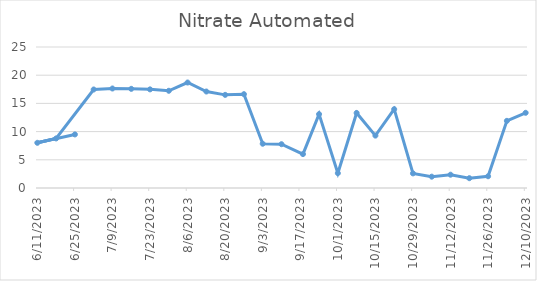
| Category | Series 0 |
|---|---|
| 6/25/23 | 9.499 |
| 6/11/23 | 8.014 |
| 6/18/23 | 8.787 |
| 7/2/23 | 17.468 |
| 7/9/23 | 17.642 |
| 7/16/23 | 17.58 |
| 7/23/23 | 17.487 |
| 7/30/23 | 17.236 |
| 8/6/23 | 18.702 |
| 8/13/23 | 17.108 |
| 8/20/23 | 16.513 |
| 8/27/23 | 16.636 |
| 9/3/23 | 7.847 |
| 9/10/23 | 7.766 |
| 9/18/23 | 6.01 |
| 9/24/23 | 13.093 |
| 10/1/23 | 2.632 |
| 10/8/23 | 13.306 |
| 10/15/23 | 9.29 |
| 10/22/23 | 13.975 |
| 10/29/23 | 2.59 |
| 11/5/23 | 2.01 |
| 11/12/23 | 2.358 |
| 11/19/23 | 1.739 |
| 11/26/23 | 2.083 |
| 12/3/23 | 11.905 |
| 12/10/23 | 13.333 |